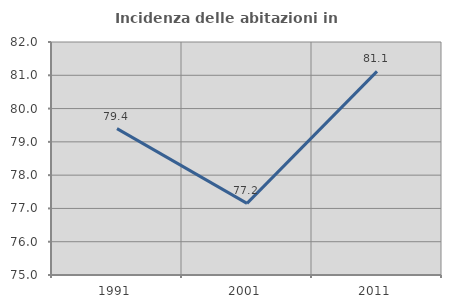
| Category | Incidenza delle abitazioni in proprietà  |
|---|---|
| 1991.0 | 79.396 |
| 2001.0 | 77.152 |
| 2011.0 | 81.118 |